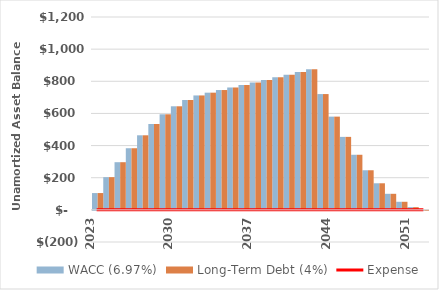
| Category | WACC (6.97%) | Long-Term Debt (4%) |
|---|---|---|
| 2023.0 | 104.561 | 104.561 |
| 2024.0 | 203.489 | 203.489 |
| 2025.0 | 296.535 | 296.535 |
| 2026.0 | 383.438 | 383.438 |
| 2027.0 | 463.924 | 463.924 |
| 2028.0 | 534.387 | 534.387 |
| 2029.0 | 594.624 | 594.624 |
| 2030.0 | 644.433 | 644.433 |
| 2031.0 | 683.605 | 683.605 |
| 2032.0 | 711.926 | 711.926 |
| 2033.0 | 729.18 | 729.18 |
| 2034.0 | 745.602 | 745.602 |
| 2035.0 | 761.448 | 761.448 |
| 2036.0 | 776.993 | 776.993 |
| 2037.0 | 792.533 | 792.533 |
| 2038.0 | 808.383 | 808.383 |
| 2039.0 | 824.551 | 824.551 |
| 2040.0 | 841.042 | 841.042 |
| 2041.0 | 857.863 | 857.863 |
| 2042.0 | 875.02 | 875.02 |
| 2043.0 | 720.512 | 720.512 |
| 2044.0 | 580.115 | 580.115 |
| 2045.0 | 454.11 | 454.11 |
| 2046.0 | 342.786 | 342.786 |
| 2047.0 | 246.437 | 246.437 |
| 2048.0 | 165.362 | 165.362 |
| 2049.0 | 99.865 | 99.865 |
| 2050.0 | 50.26 | 50.26 |
| 2051.0 | 16.864 | 16.864 |
| 2052.0 | 0 | 0 |